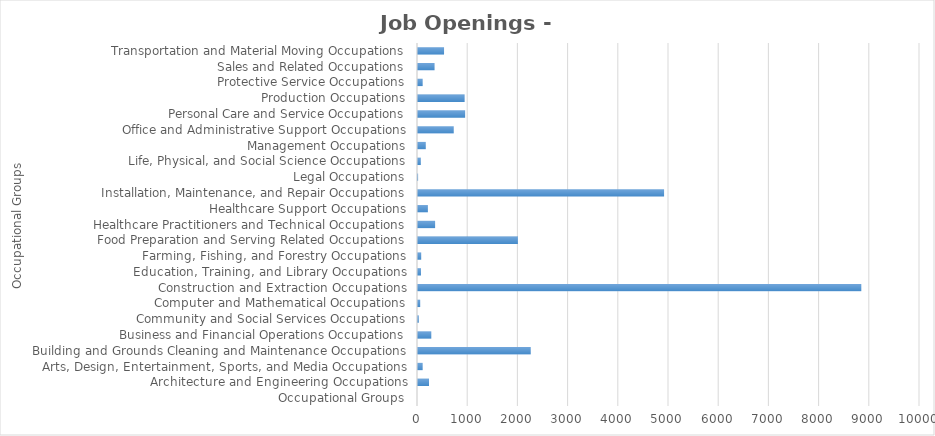
| Category | Series1 |
|---|---|
| Occupational Groups | 0 |
| Architecture and Engineering Occupations | 219 |
| Arts, Design, Entertainment, Sports, and Media Occupations | 93 |
| Building and Grounds Cleaning and Maintenance Occupations | 2246 |
| Business and Financial Operations Occupations | 265 |
| Community and Social Services Occupations | 16 |
| Computer and Mathematical Occupations | 44 |
| Construction and Extraction Occupations | 8831 |
| Education, Training, and Library Occupations | 59 |
| Farming, Fishing, and Forestry Occupations | 64 |
| Food Preparation and Serving Related Occupations | 1990 |
| Healthcare Practitioners and Technical Occupations | 341 |
| Healthcare Support Occupations | 197 |
| Installation, Maintenance, and Repair Occupations | 4902 |
| Legal Occupations | 2 |
| Life, Physical, and Social Science Occupations | 56 |
| Management Occupations | 155 |
| Office and Administrative Support Occupations | 712 |
| Personal Care and Service Occupations | 939 |
| Production Occupations | 929 |
| Protective Service Occupations | 93 |
| Sales and Related Occupations | 330 |
| Transportation and Material Moving Occupations | 519 |